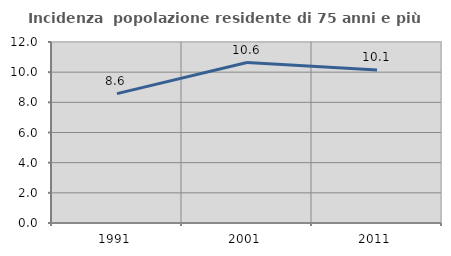
| Category | Incidenza  popolazione residente di 75 anni e più |
|---|---|
| 1991.0 | 8.576 |
| 2001.0 | 10.64 |
| 2011.0 | 10.137 |